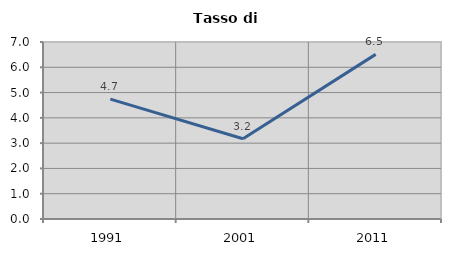
| Category | Tasso di disoccupazione   |
|---|---|
| 1991.0 | 4.74 |
| 2001.0 | 3.172 |
| 2011.0 | 6.511 |